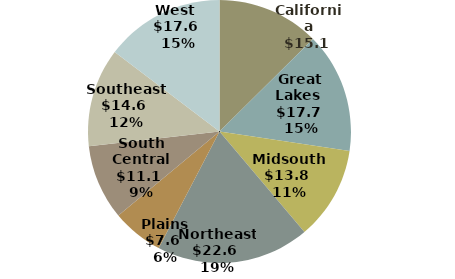
| Category | Series 0 |
|---|---|
| California | 15.117 |
| Great Lakes  | 17.74 |
| Midsouth  | 13.782 |
| Northeast  | 22.605 |
| Plains  | 7.588 |
| South Central  | 11.094 |
| Southeast  | 14.556 |
| West  | 17.631 |